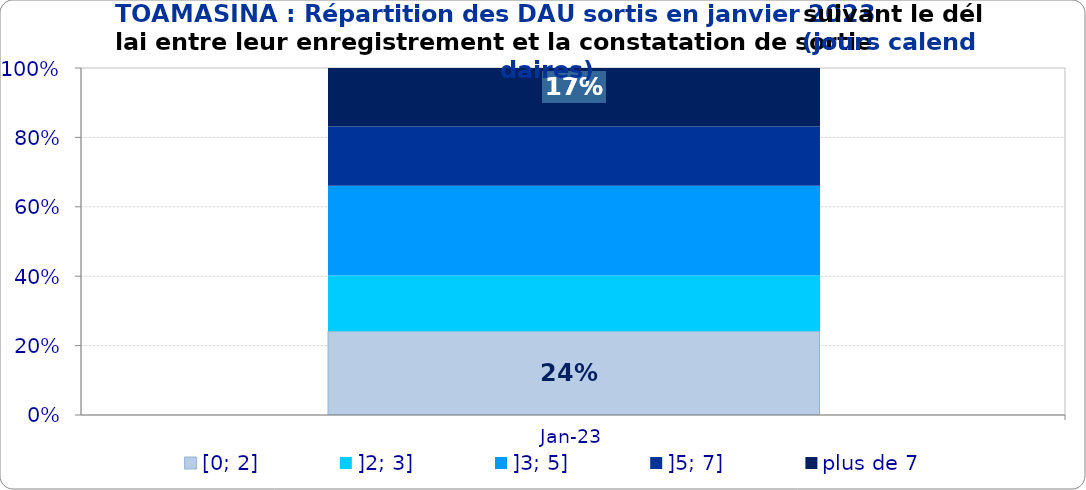
| Category | [0; 2] | ]2; 3] | ]3; 5] | ]5; 7] | plus de 7 |
|---|---|---|---|---|---|
| 2023-01-01 | 0.242 | 0.161 | 0.258 | 0.171 | 0.169 |